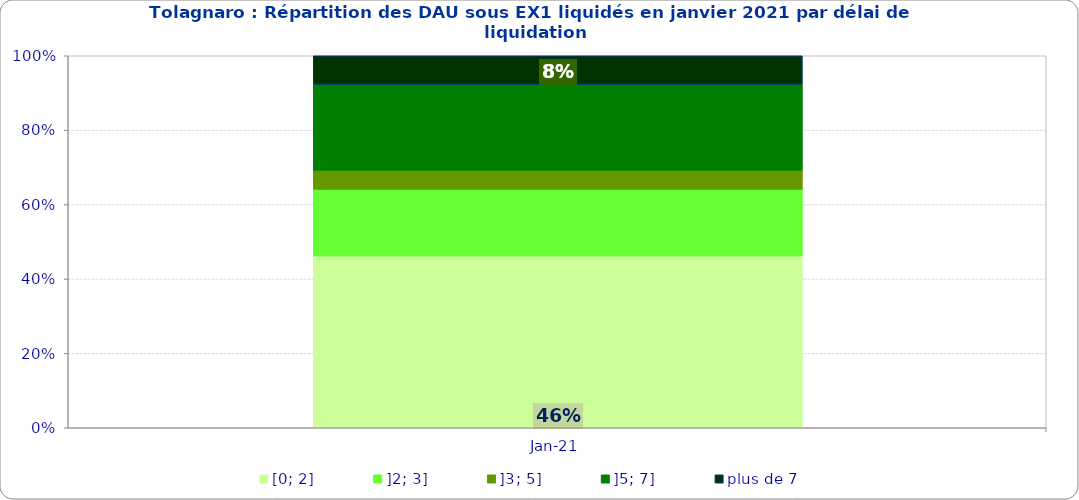
| Category | [0; 2] | ]2; 3] | ]3; 5] | ]5; 7] | plus de 7 |
|---|---|---|---|---|---|
| 2021-01-01 | 0.462 | 0.179 | 0.051 | 0.231 | 0.077 |